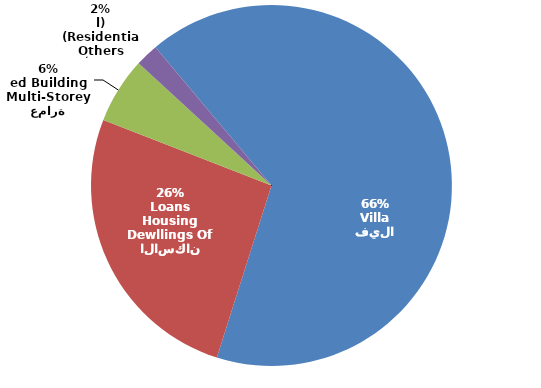
| Category | Series 0 |
|---|---|
| فيلا
Villa | 1474 |
| مساكن قروض الاسكان
Dewllings Of Housing Loans | 581 |
| عمارة
Multi-Storeyed Building | 132 |
| أخرى
Others (Residential) | 46 |